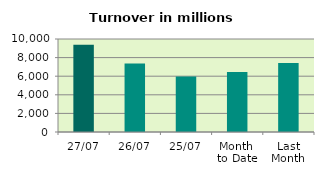
| Category | Series 0 |
|---|---|
| 27/07 | 9371.256 |
| 26/07 | 7365.006 |
| 25/07 | 5979.12 |
| Month 
to Date | 6443.773 |
| Last
Month | 7424.465 |